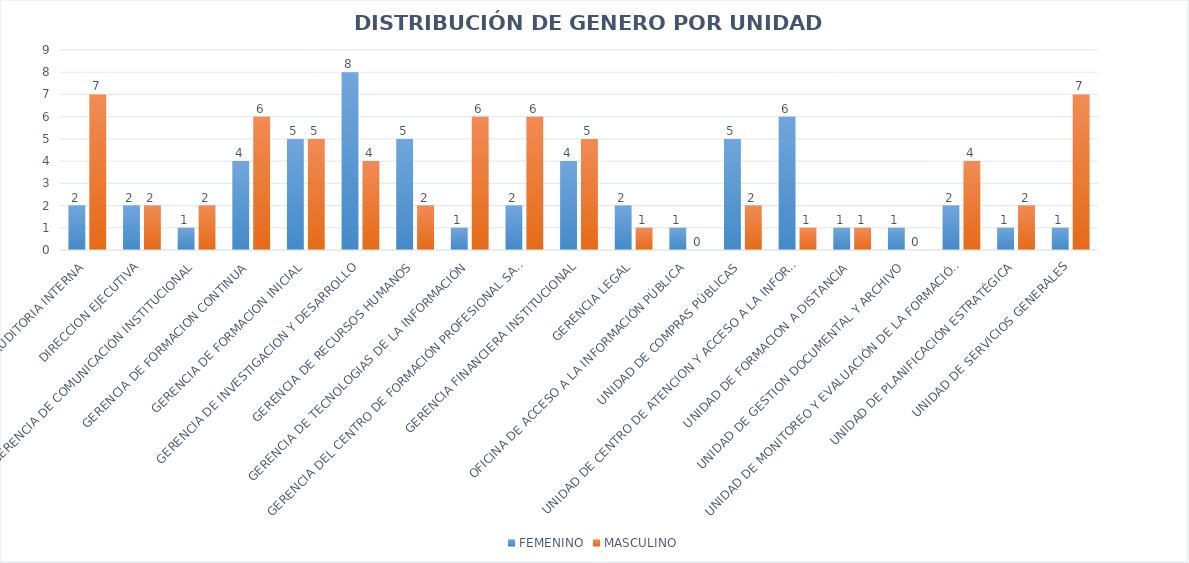
| Category | FEMENINO | MASCULINO |
|---|---|---|
| AUDITORIA INTERNA | 2 | 7 |
| DIRECCION EJECUTIVA | 2 | 2 |
| GERENCIA DE COMUNICACIÓN INSTITUCIONAL | 1 | 2 |
| GERENCIA DE FORMACION CONTINUA | 4 | 6 |
| GERENCIA DE FORMACION INICIAL | 5 | 5 |
| GERENCIA DE INVESTIGACION Y DESARROLLO | 8 | 4 |
| GERENCIA DE RECURSOS HUMANOS | 5 | 2 |
| GERENCIA DE TECNOLOGIAS DE LA INFORMACIÓN | 1 | 6 |
| GERENCIA DEL CENTRO DE FORMACIÓN PROFESIONAL SAN BARTOLO | 2 | 6 |
| GERENCIA FINANCIERA INSTITUCIONAL | 4 | 5 |
| GERENCIA LEGAL | 2 | 1 |
| OFICINA DE ACCESO A LA INFORMACIÓN PÚBLICA | 1 | 0 |
| UNIDAD DE COMPRAS PÚBLICAS | 5 | 2 |
| UNIDAD DE CENTRO DE ATENCION Y ACCESO A LA INFORMACION | 6 | 1 |
| UNIDAD DE FORMACION A DISTANCIA | 1 | 1 |
| UNIDAD DE GESTION DOCUMENTAL Y ARCHIVO | 1 | 0 |
| UNIDAD DE MONITOREO Y EVALUACIÓN DE LA FORMACIÓN PROFESIONAL | 2 | 4 |
| UNIDAD DE PLANIFICACIÓN ESTRATÉGICA | 1 | 2 |
| UNIDAD DE SERVICIOS GENERALES | 1 | 7 |